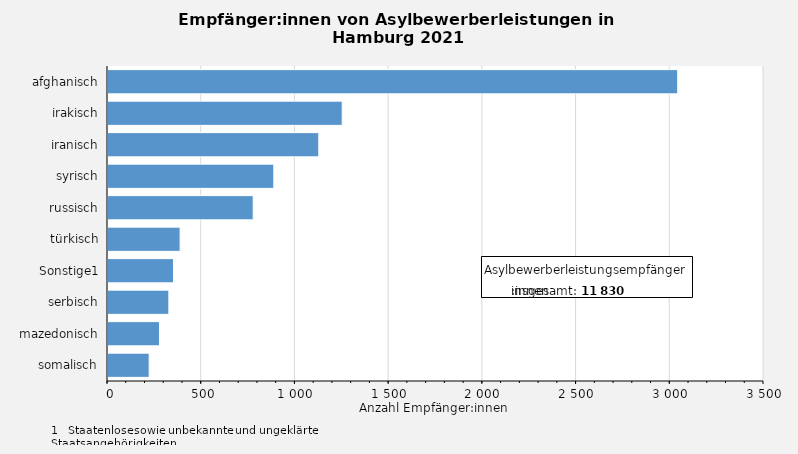
| Category | Anzahl der Empfänger:innen von Asylbewerberleistungen |
|---|---|
| afghanisch | 3045 |
| irakisch | 1255 |
| iranisch | 1130 |
| syrisch | 890 |
| russisch | 780 |
| türkisch | 390 |
| Sonstige1 | 355 |
| serbisch | 330 |
| mazedonisch | 280 |
| somalisch | 225 |